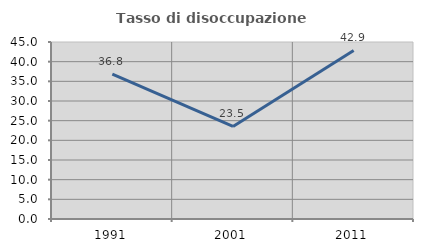
| Category | Tasso di disoccupazione giovanile  |
|---|---|
| 1991.0 | 36.842 |
| 2001.0 | 23.529 |
| 2011.0 | 42.857 |